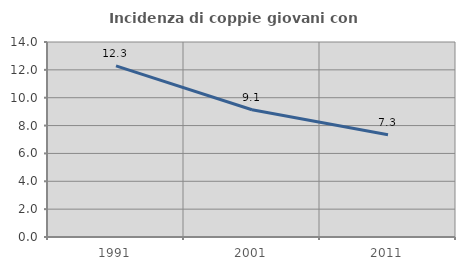
| Category | Incidenza di coppie giovani con figli |
|---|---|
| 1991.0 | 12.285 |
| 2001.0 | 9.138 |
| 2011.0 | 7.336 |